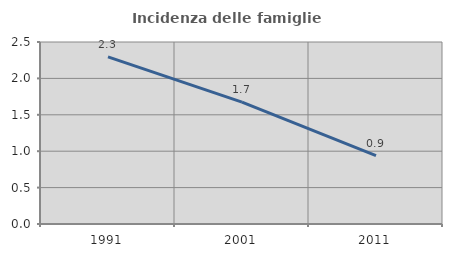
| Category | Incidenza delle famiglie numerose |
|---|---|
| 1991.0 | 2.296 |
| 2001.0 | 1.674 |
| 2011.0 | 0.94 |